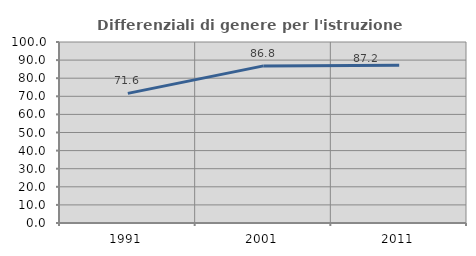
| Category | Differenziali di genere per l'istruzione superiore |
|---|---|
| 1991.0 | 71.62 |
| 2001.0 | 86.794 |
| 2011.0 | 87.15 |